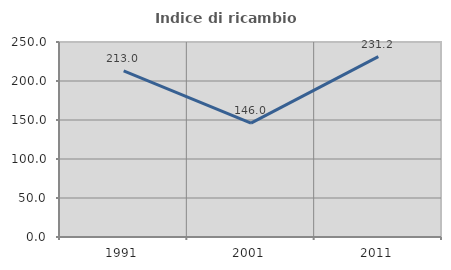
| Category | Indice di ricambio occupazionale  |
|---|---|
| 1991.0 | 213.043 |
| 2001.0 | 146.043 |
| 2011.0 | 231.159 |